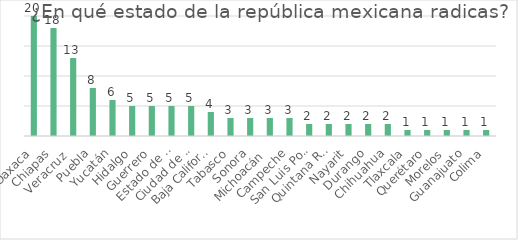
| Category | Series 0 |
|---|---|
|  Oaxaca | 20 |
|  Chiapas | 18 |
|  Veracruz  | 13 |
|  Puebla | 8 |
|  Yucatán | 6 |
|  Hidalgo | 5 |
|  Guerrero | 5 |
|  Estado de México | 5 |
|  Ciudad de México | 5 |
|  Baja California | 4 |
|  Tabasco | 3 |
|  Sonora | 3 |
|  Michoacán  | 3 |
|  Campeche | 3 |
|  San Luis Potosí | 2 |
|  Quintana Roo | 2 |
|  Nayarit | 2 |
|  Durango | 2 |
|  Chihuahua | 2 |
|  Tlaxcala | 1 |
|  Querétaro | 1 |
|  Morelos | 1 |
|  Guanajuato | 1 |
|  Colima | 1 |